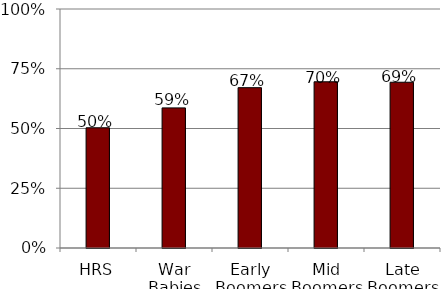
| Category | Women |
|---|---|
| HRS | 0.503 |
| War Babies | 0.586 |
| Early Boomers | 0.671 |
| Mid Boomers | 0.695 |
| Late Boomers | 0.694 |